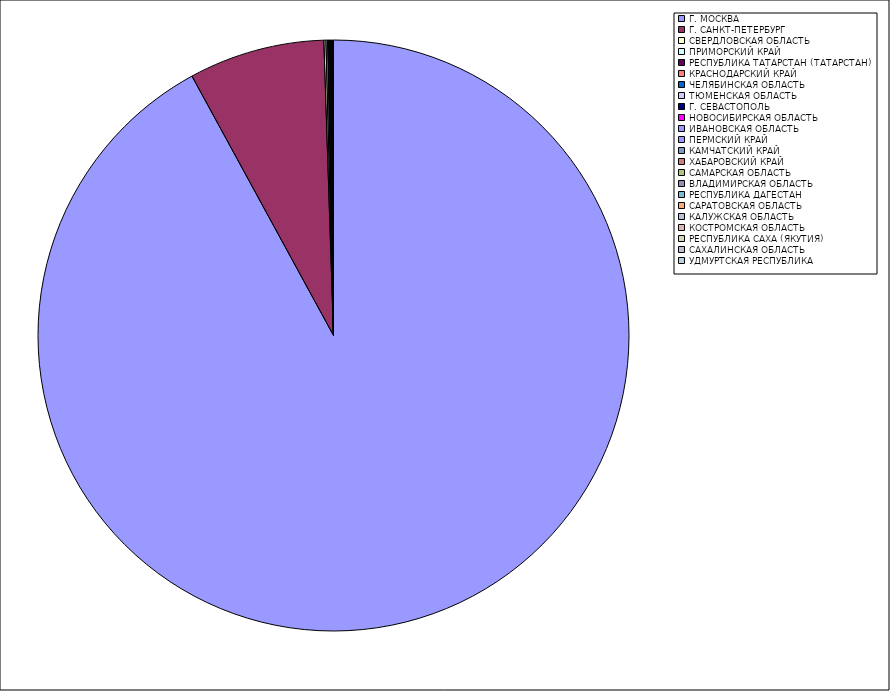
| Category | Оборот |
|---|---|
| Г. МОСКВА | 92.009 |
| Г. САНКТ-ПЕТЕРБУРГ | 7.425 |
| СВЕРДЛОВСКАЯ ОБЛАСТЬ | 0.111 |
| ПРИМОРСКИЙ КРАЙ | 0.091 |
| РЕСПУБЛИКА ТАТАРСТАН (ТАТАРСТАН) | 0.052 |
| КРАСНОДАРСКИЙ КРАЙ | 0.049 |
| ЧЕЛЯБИНСКАЯ ОБЛАСТЬ | 0.037 |
| ТЮМЕНСКАЯ ОБЛАСТЬ | 0.025 |
| Г. СЕВАСТОПОЛЬ | 0.024 |
| НОВОСИБИРСКАЯ ОБЛАСТЬ | 0.017 |
| ИВАНОВСКАЯ ОБЛАСТЬ | 0.014 |
| ПЕРМСКИЙ КРАЙ | 0.012 |
| КАМЧАТСКИЙ КРАЙ | 0.011 |
| ХАБАРОВСКИЙ КРАЙ | 0.011 |
| САМАРСКАЯ ОБЛАСТЬ | 0.01 |
| ВЛАДИМИРСКАЯ ОБЛАСТЬ | 0.008 |
| РЕСПУБЛИКА ДАГЕСТАН | 0.008 |
| САРАТОВСКАЯ ОБЛАСТЬ | 0.008 |
| КАЛУЖСКАЯ ОБЛАСТЬ | 0.008 |
| КОСТРОМСКАЯ ОБЛАСТЬ | 0.007 |
| РЕСПУБЛИКА САХА (ЯКУТИЯ) | 0.006 |
| САХАЛИНСКАЯ ОБЛАСТЬ | 0.006 |
| УДМУРТСКАЯ РЕСПУБЛИКА | 0.006 |